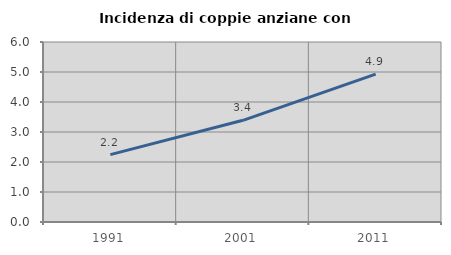
| Category | Incidenza di coppie anziane con figli |
|---|---|
| 1991.0 | 2.247 |
| 2001.0 | 3.39 |
| 2011.0 | 4.928 |